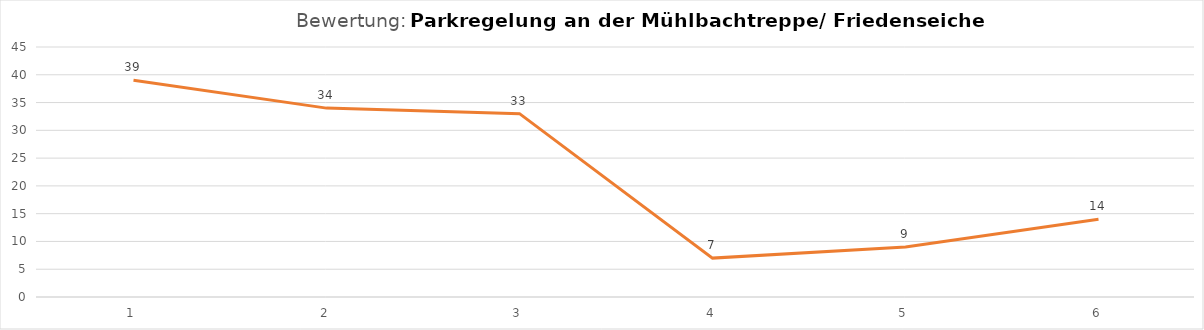
| Category | Series 0 |
|---|---|
| 1.0 | 39 |
| 2.0 | 34 |
| 3.0 | 33 |
| 4.0 | 7 |
| 5.0 | 9 |
| 6.0 | 14 |